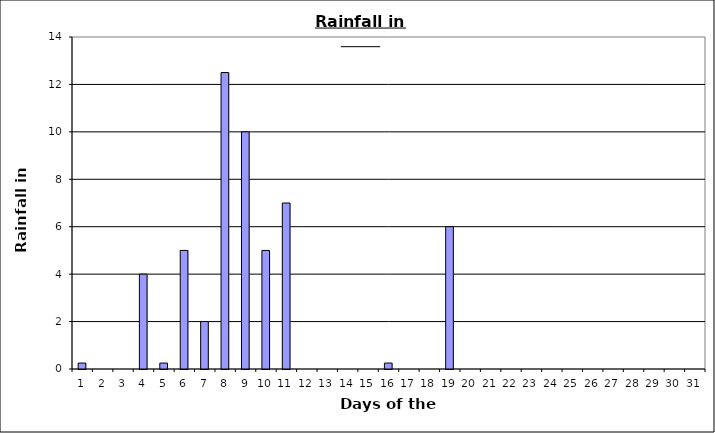
| Category | Series 0 |
|---|---|
| 0 | 0.25 |
| 1 | 0 |
| 2 | 0 |
| 3 | 4 |
| 4 | 0.25 |
| 5 | 5 |
| 6 | 2 |
| 7 | 12.5 |
| 8 | 10 |
| 9 | 5 |
| 10 | 7 |
| 11 | 0 |
| 12 | 0 |
| 13 | 0 |
| 14 | 0 |
| 15 | 0.25 |
| 16 | 0 |
| 17 | 0 |
| 18 | 6 |
| 19 | 0 |
| 20 | 0 |
| 21 | 0 |
| 22 | 0 |
| 23 | 0 |
| 24 | 0 |
| 25 | 0 |
| 26 | 0 |
| 27 | 0 |
| 28 | 0 |
| 29 | 0 |
| 30 | 0 |